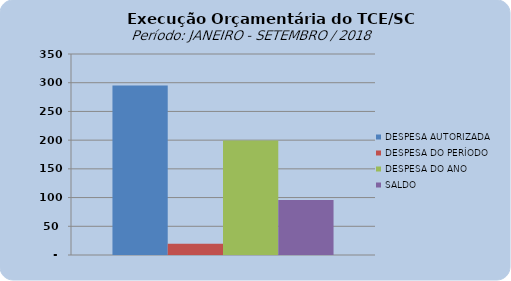
| Category | DESPESA AUTORIZADA | DESPESA DO PERÍODO | DESPESA DO ANO | SALDO |
|---|---|---|---|---|
| 0 | 295145756.33 | 19755378.25 | 199564083.18 | 95581673.15 |